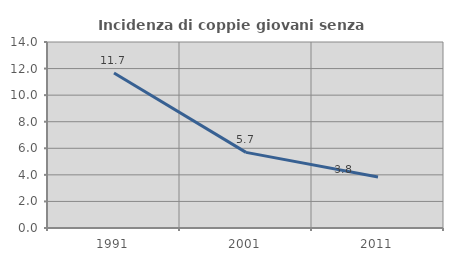
| Category | Incidenza di coppie giovani senza figli |
|---|---|
| 1991.0 | 11.661 |
| 2001.0 | 5.694 |
| 2011.0 | 3.846 |